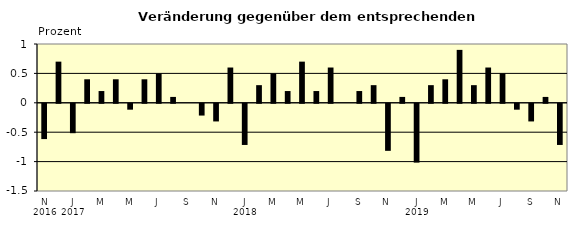
| Category | Series 0 |
|---|---|
| 0 | -0.6 |
| 1 | 0.7 |
| 2 | -0.5 |
| 3 | 0.4 |
| 4 | 0.2 |
| 5 | 0.4 |
| 6 | -0.1 |
| 7 | 0.4 |
| 8 | 0.5 |
| 9 | 0.1 |
| 10 | 0 |
| 11 | -0.2 |
| 12 | -0.3 |
| 13 | 0.6 |
| 14 | -0.7 |
| 15 | 0.3 |
| 16 | 0.5 |
| 17 | 0.2 |
| 18 | 0.7 |
| 19 | 0.2 |
| 20 | 0.6 |
| 21 | 0 |
| 22 | 0.2 |
| 23 | 0.3 |
| 24 | -0.8 |
| 25 | 0.1 |
| 26 | -1 |
| 27 | 0.3 |
| 28 | 0.4 |
| 29 | 0.9 |
| 30 | 0.3 |
| 31 | 0.6 |
| 32 | 0.5 |
| 33 | -0.1 |
| 34 | -0.3 |
| 35 | 0.1 |
| 36 | -0.7 |